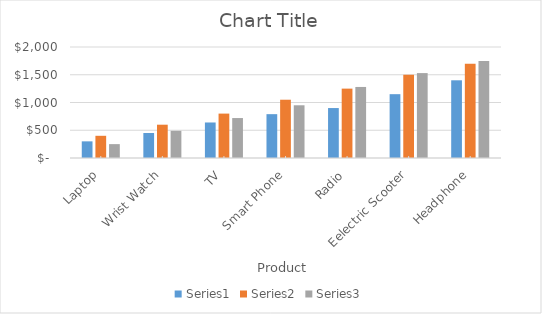
| Category | Series 0 | Series 1 | Series 2 |
|---|---|---|---|
| Laptop | 300 | 400 | 250 |
| Wrist Watch | 450 | 600 | 490 |
| TV | 640 | 800 | 720 |
| Smart Phone | 790 | 1050 | 950 |
| Radio | 900 | 1250 | 1280 |
| Eelectric Scooter | 1150 | 1500 | 1530 |
| Headphone | 1400 | 1700 | 1750 |